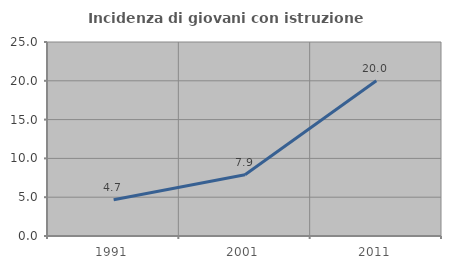
| Category | Incidenza di giovani con istruzione universitaria |
|---|---|
| 1991.0 | 4.659 |
| 2001.0 | 7.889 |
| 2011.0 | 20 |